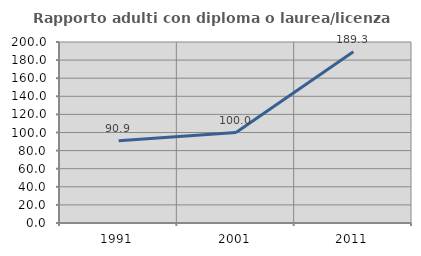
| Category | Rapporto adulti con diploma o laurea/licenza media  |
|---|---|
| 1991.0 | 90.909 |
| 2001.0 | 100 |
| 2011.0 | 189.286 |